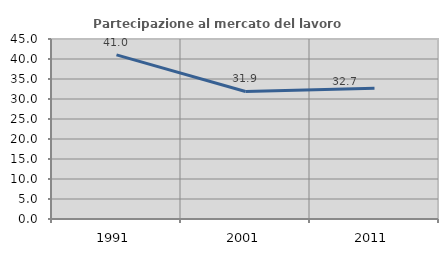
| Category | Partecipazione al mercato del lavoro  femminile |
|---|---|
| 1991.0 | 41.038 |
| 2001.0 | 31.886 |
| 2011.0 | 32.716 |